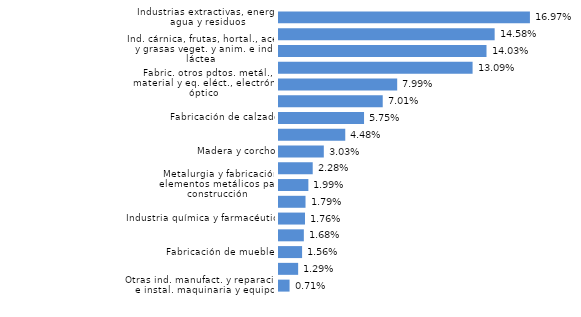
| Category | La Rioja |
|---|---|
| Otras ind. manufact. y reparación e instal. maquinaria y equipo | 0.007 |
| Forja y talleres | 0.013 |
| Fabricación de muebles | 0.016 |
| Ind. textil, confección, cuero, marroquinería y viaje | 0.017 |
| Industria química y farmacéutica | 0.018 |
| Papel, artes gráficas y reproducción soportes grabados | 0.018 |
| Metalurgia y fabricación elementos metálicos para construcción | 0.02 |
| Productos minerales no metálicos diversos | 0.023 |
| Madera y corcho | 0.03 |
| Fabricación de maquinaria, equipo y material de transporte | 0.045 |
| Fabricación de calzado | 0.058 |
| Caucho y materias plásticas | 0.07 |
| Fabric. otros pdtos. metál., material y eq. eléct., electrón. y óptico | 0.08 |
| Otras ind. alimenticias, bebidas (exto. elaborac. vinos) y tabaco | 0.131 |
| Ind. cárnica, frutas, hortal., aceit. y grasas veget. y anim. e ind. láctea | 0.14 |
| Elaboración de vinos | 0.146 |
| Industrias extractivas, energía, agua y residuos | 0.17 |